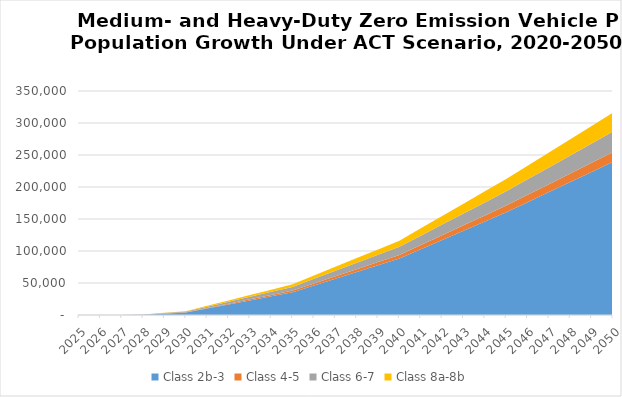
| Category | Class 2b-3 | Class 4-5 | Class 6-7 | Class 8a-8b |
|---|---|---|---|---|
| 2025.0 | 0 | 0 | 0 | 0 |
| 2026.0 | 0 | 0 | 0 | 0 |
| 2027.0 | 0 | 11.574 | 24.376 | 14.062 |
| 2028.0 | 411.759 | 107.973 | 247.285 | 146.752 |
| 2029.0 | 1855.445 | 325.078 | 760.092 | 602.344 |
| 2030.0 | 3740 | 460 | 1120 | 540 |
| 2031.0 | 10104 | 874 | 2066 | 1230 |
| 2032.0 | 16468 | 1288 | 3012 | 1920 |
| 2033.0 | 22832 | 1702 | 3958 | 2610 |
| 2034.0 | 29196 | 2116 | 4904 | 3300 |
| 2035.0 | 35560 | 2530 | 5850 | 3990 |
| 2036.0 | 46102 | 3154 | 7208 | 5118 |
| 2037.0 | 56644 | 3778 | 8566 | 6246 |
| 2038.0 | 67186 | 4402 | 9924 | 7374 |
| 2039.0 | 77728 | 5026 | 11282 | 8502 |
| 2040.0 | 88270 | 5650 | 12640 | 9630 |
| 2041.0 | 102718 | 6610 | 14576 | 11544 |
| 2042.0 | 117166 | 7570 | 16512 | 13458 |
| 2043.0 | 131614 | 8530 | 18448 | 15372 |
| 2044.0 | 146062 | 9490 | 20384 | 17286 |
| 2045.0 | 160510 | 10450 | 22320 | 19200 |
| 2046.0 | 176270 | 11444 | 24256 | 21254 |
| 2047.0 | 192030 | 12438 | 26192 | 23308 |
| 2048.0 | 207790 | 13432 | 28128 | 25362 |
| 2049.0 | 223550 | 14426 | 30064 | 27416 |
| 2050.0 | 239310 | 15420 | 32000 | 29470 |